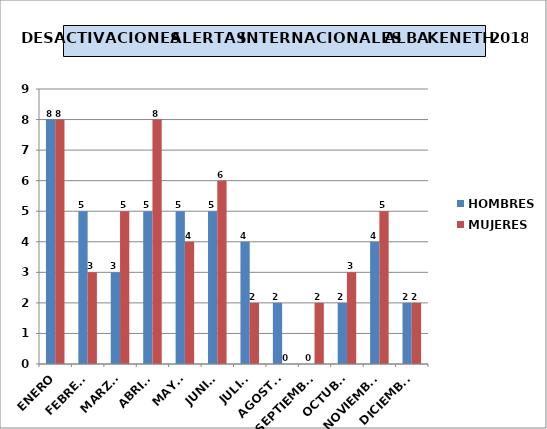
| Category | HOMBRES | MUJERES |
|---|---|---|
| ENERO | 8 | 8 |
| FEBRERO | 5 | 3 |
| MARZO | 3 | 5 |
| ABRIL  | 5 | 8 |
| MAYO | 5 | 4 |
| JUNIO | 5 | 6 |
| JULIO | 4 | 2 |
| AGOSTO | 2 | 0 |
| SEPTIEMBRE | 0 | 2 |
| OCTUBRE | 2 | 3 |
| NOVIEMBRE | 4 | 5 |
| DICIEMBRE | 2 | 2 |